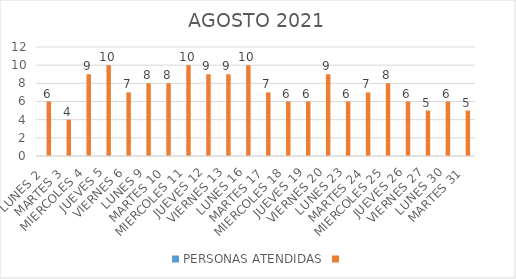
| Category | PERSONAS ATENDIDAS | Series 1 |
|---|---|---|
| LUNES 2  |  | 6 |
| MARTES 3 |  | 4 |
| MIERCOLES 4 |  | 9 |
| JUEVES 5 |  | 10 |
| VIERNES 6 |  | 7 |
| LUNES 9 |  | 8 |
| MARTES 10 |  | 8 |
| MIERCOLES 11 |  | 10 |
| JUEVES 12 |  | 9 |
| VIERNES 13 |  | 9 |
| LUNES 16 |  | 10 |
| MARTES 17 |  | 7 |
| MIERCOLES 18 |  | 6 |
| JUEVES 19 |  | 6 |
| VIERNES 20 |  | 9 |
| LUNES 23 |  | 6 |
| MARTES 24 |  | 7 |
| MIERCOLES 25 |  | 8 |
| JUEVES 26 |  | 6 |
| VIERNES 27 |  | 5 |
| LUNES 30 |  | 6 |
| MARTES 31 |  | 5 |